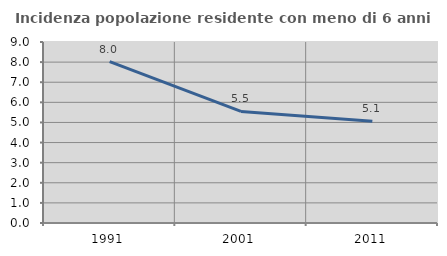
| Category | Incidenza popolazione residente con meno di 6 anni |
|---|---|
| 1991.0 | 8.026 |
| 2001.0 | 5.546 |
| 2011.0 | 5.061 |